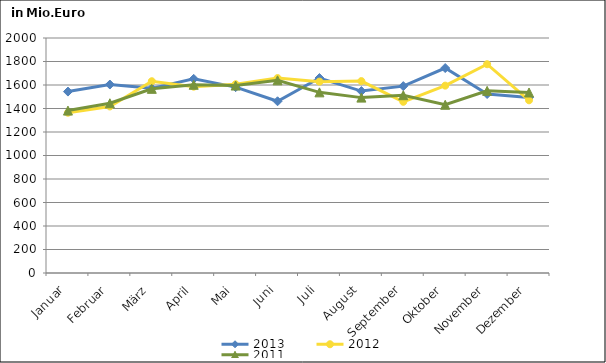
| Category | 2013 | 2012 | 2011 |
|---|---|---|---|
| Januar | 1543.949 | 1364.093 | 1382.249 |
| Februar | 1603.963 | 1417.231 | 1444.366 |
| März | 1571.45 | 1632.04 | 1567.398 |
| April | 1652.249 | 1585.623 | 1601.916 |
| Mai | 1581.875 | 1606.708 | 1595.296 |
| Juni | 1461.452 | 1659.207 | 1639.734 |
| Juli | 1659.178 | 1628.599 | 1537.39 |
| August | 1548.153 | 1633.093 | 1492.621 |
| September | 1590.452 | 1456.973 | 1513.049 |
| Oktober | 1744.21 | 1594.566 | 1431.698 |
| November | 1523.225 | 1776.795 | 1550.124 |
| Dezember | 1493.69 | 1469.694 | 1536.191 |